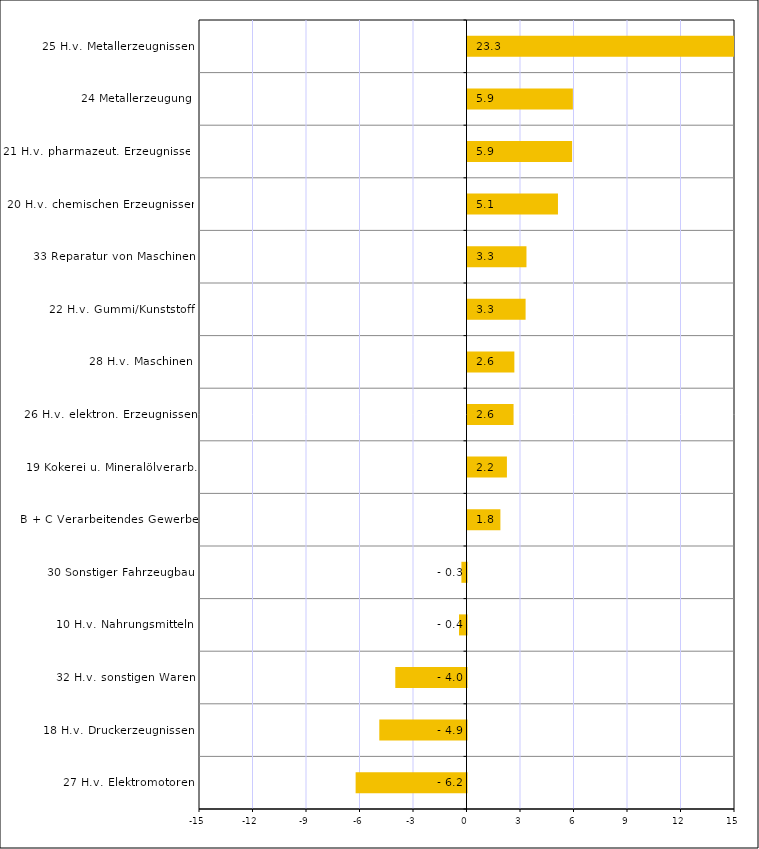
| Category | Series 0 |
|---|---|
| 27 H.v. Elektromotoren | -6.217 |
| 18 H.v. Druckerzeugnissen | -4.89 |
| 32 H.v. sonstigen Waren | -3.993 |
| 10 H.v. Nahrungsmitteln | -0.421 |
| 30 Sonstiger Fahrzeugbau | -0.286 |
| B + C Verarbeitendes Gewerbe | 1.844 |
| 19 Kokerei u. Mineralölverarb. | 2.21 |
| 26 H.v. elektron. Erzeugnissen | 2.583 |
| 28 H.v. Maschinen | 2.627 |
| 22 H.v. Gummi/Kunststoff | 3.258 |
| 33 Reparatur von Maschinen | 3.306 |
| 20 H.v. chemischen Erzeugnissen | 5.073 |
| 21 H.v. pharmazeut. Erzeugnissen | 5.866 |
| 24 Metallerzeugung | 5.909 |
| 25 H.v. Metallerzeugnissen | 23.251 |